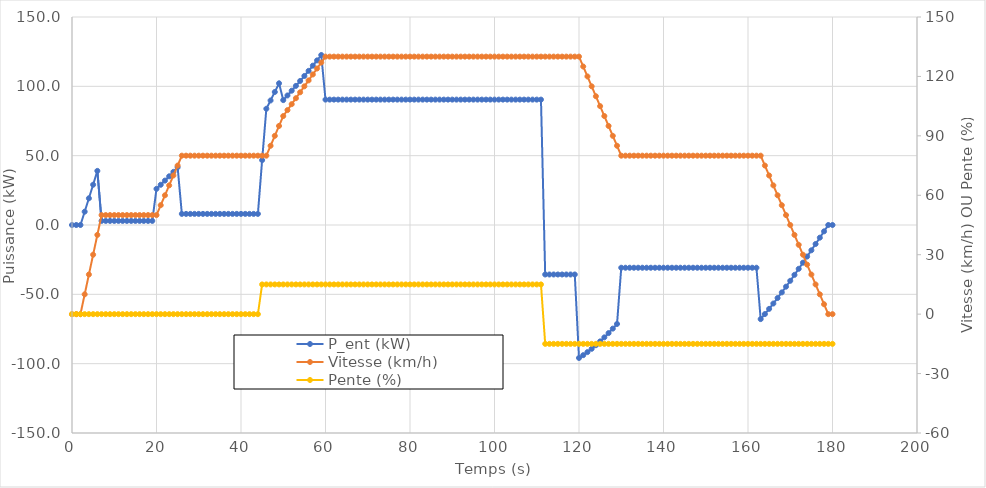
| Category | P_ent (kW) |
|---|---|
| 0.0 | 0 |
| 1.0 | 0 |
| 2.0 | 0 |
| 3.0 | 9.597 |
| 4.0 | 19.257 |
| 5.0 | 29.043 |
| 6.0 | 39.02 |
| 7.0 | 2.953 |
| 8.0 | 2.953 |
| 9.0 | 2.953 |
| 10.0 | 2.953 |
| 11.0 | 2.953 |
| 12.0 | 2.953 |
| 13.0 | 2.953 |
| 14.0 | 2.953 |
| 15.0 | 2.953 |
| 16.0 | 2.953 |
| 17.0 | 2.953 |
| 18.0 | 2.953 |
| 19.0 | 2.953 |
| 20.0 | 26.101 |
| 21.0 | 29.016 |
| 22.0 | 32.018 |
| 23.0 | 35.114 |
| 24.0 | 38.313 |
| 25.0 | 41.624 |
| 26.0 | 8.015 |
| 27.0 | 8.015 |
| 28.0 | 8.015 |
| 29.0 | 8.015 |
| 30.0 | 8.015 |
| 31.0 | 8.015 |
| 32.0 | 8.015 |
| 33.0 | 8.015 |
| 34.0 | 8.015 |
| 35.0 | 8.015 |
| 36.0 | 8.015 |
| 37.0 | 8.015 |
| 38.0 | 8.015 |
| 39.0 | 8.015 |
| 40.0 | 8.015 |
| 41.0 | 8.015 |
| 42.0 | 8.015 |
| 43.0 | 8.015 |
| 44.0 | 8.015 |
| 45.0 | 46.792 |
| 46.0 | 83.829 |
| 47.0 | 89.808 |
| 48.0 | 95.921 |
| 49.0 | 102.177 |
| 50.0 | 90.064 |
| 51.0 | 93.428 |
| 52.0 | 96.85 |
| 53.0 | 100.332 |
| 54.0 | 103.877 |
| 55.0 | 107.485 |
| 56.0 | 111.159 |
| 57.0 | 114.899 |
| 58.0 | 118.709 |
| 59.0 | 122.59 |
| 60.0 | 90.431 |
| 61.0 | 90.431 |
| 62.0 | 90.431 |
| 63.0 | 90.431 |
| 64.0 | 90.431 |
| 65.0 | 90.431 |
| 66.0 | 90.431 |
| 67.0 | 90.431 |
| 68.0 | 90.431 |
| 69.0 | 90.431 |
| 70.0 | 90.431 |
| 71.0 | 90.431 |
| 72.0 | 90.431 |
| 73.0 | 90.431 |
| 74.0 | 90.431 |
| 75.0 | 90.431 |
| 76.0 | 90.431 |
| 77.0 | 90.431 |
| 78.0 | 90.431 |
| 79.0 | 90.431 |
| 80.0 | 90.431 |
| 81.0 | 90.431 |
| 82.0 | 90.431 |
| 83.0 | 90.431 |
| 84.0 | 90.431 |
| 85.0 | 90.431 |
| 86.0 | 90.431 |
| 87.0 | 90.431 |
| 88.0 | 90.431 |
| 89.0 | 90.431 |
| 90.0 | 90.431 |
| 91.0 | 90.431 |
| 92.0 | 90.431 |
| 93.0 | 90.431 |
| 94.0 | 90.431 |
| 95.0 | 90.431 |
| 96.0 | 90.431 |
| 97.0 | 90.431 |
| 98.0 | 90.431 |
| 99.0 | 90.431 |
| 100.0 | 90.431 |
| 101.0 | 90.431 |
| 102.0 | 90.431 |
| 103.0 | 90.431 |
| 104.0 | 90.431 |
| 105.0 | 90.431 |
| 106.0 | 90.431 |
| 107.0 | 90.431 |
| 108.0 | 90.431 |
| 109.0 | 90.431 |
| 110.0 | 90.431 |
| 111.0 | 90.431 |
| 112.0 | -35.688 |
| 113.0 | -35.688 |
| 114.0 | -35.688 |
| 115.0 | -35.688 |
| 116.0 | -35.688 |
| 117.0 | -35.688 |
| 118.0 | -35.688 |
| 119.0 | -35.688 |
| 120.0 | -95.873 |
| 121.0 | -93.866 |
| 122.0 | -91.662 |
| 123.0 | -89.267 |
| 124.0 | -86.691 |
| 125.0 | -83.941 |
| 126.0 | -81.025 |
| 127.0 | -77.95 |
| 128.0 | -74.725 |
| 129.0 | -71.358 |
| 130.0 | -30.82 |
| 131.0 | -30.82 |
| 132.0 | -30.82 |
| 133.0 | -30.82 |
| 134.0 | -30.82 |
| 135.0 | -30.82 |
| 136.0 | -30.82 |
| 137.0 | -30.82 |
| 138.0 | -30.82 |
| 139.0 | -30.82 |
| 140.0 | -30.82 |
| 141.0 | -30.82 |
| 142.0 | -30.82 |
| 143.0 | -30.82 |
| 144.0 | -30.82 |
| 145.0 | -30.82 |
| 146.0 | -30.82 |
| 147.0 | -30.82 |
| 148.0 | -30.82 |
| 149.0 | -30.82 |
| 150.0 | -30.82 |
| 151.0 | -30.82 |
| 152.0 | -30.82 |
| 153.0 | -30.82 |
| 154.0 | -30.82 |
| 155.0 | -30.82 |
| 156.0 | -30.82 |
| 157.0 | -30.82 |
| 158.0 | -30.82 |
| 159.0 | -30.82 |
| 160.0 | -30.82 |
| 161.0 | -30.82 |
| 162.0 | -30.82 |
| 163.0 | -67.857 |
| 164.0 | -64.229 |
| 165.0 | -60.482 |
| 166.0 | -56.624 |
| 167.0 | -52.664 |
| 168.0 | -48.609 |
| 169.0 | -44.467 |
| 170.0 | -40.245 |
| 171.0 | -35.953 |
| 172.0 | -31.597 |
| 173.0 | -27.186 |
| 174.0 | -22.728 |
| 175.0 | -18.23 |
| 176.0 | -13.7 |
| 177.0 | -9.146 |
| 178.0 | -4.577 |
| 179.0 | 0 |
| 180.0 | 0 |